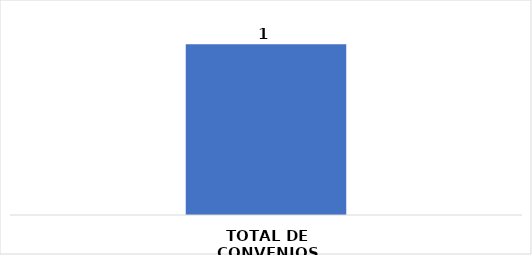
| Category | CANTIDAD |
|---|---|
| TOTAL DE CONVENIOS | 1 |